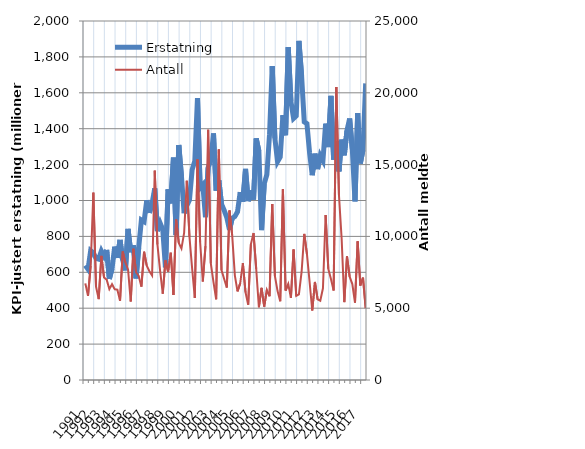
| Category | Erstatning |
|---|---|
| 1991.0 | 638.305 |
| nan | 617.49 |
| nan | 720.489 |
| nan | 708.243 |
| 1992.0 | 677.664 |
| nan | 673.336 |
| nan | 718.939 |
| nan | 690.111 |
| 1993.0 | 724.645 |
| nan | 562.774 |
| nan | 620.914 |
| nan | 743.095 |
| 1994.0 | 680.401 |
| nan | 780.53 |
| nan | 668.973 |
| nan | 610.787 |
| 1995.0 | 841.824 |
| nan | 711.536 |
| nan | 750.775 |
| nan | 566.189 |
| 1996.0 | 737.681 |
| nan | 891.182 |
| nan | 882.294 |
| nan | 1001.12 |
| 1997.0 | 931.155 |
| nan | 984.699 |
| nan | 1067.548 |
| nan | 829.951 |
| 1998.0 | 874.341 |
| nan | 837.865 |
| nan | 627.95 |
| nan | 1062.058 |
| 1999.0 | 984.04 |
| nan | 1239.159 |
| nan | 807.292 |
| nan | 1308.796 |
| 2000.0 | 1135.005 |
| nan | 928.869 |
| nan | 971.109 |
| nan | 1002.211 |
| 2001.0 | 1171.491 |
| nan | 1219.438 |
| nan | 1570.162 |
| nan | 1070.081 |
| 2002.0 | 1086.861 |
| nan | 907.106 |
| nan | 1183.634 |
| nan | 1224.277 |
| 2003.0 | 1373.705 |
| nan | 1054.474 |
| nan | 1113.11 |
| nan | 980.293 |
| 2004.0 | 945.444 |
| nan | 904.425 |
| nan | 836.38 |
| nan | 901.062 |
| 2005.0 | 910.826 |
| nan | 937.052 |
| nan | 1046.812 |
| nan | 993.378 |
| 2006.0 | 1176.283 |
| nan | 996.283 |
| nan | 1056.559 |
| nan | 1005.082 |
| 2007.0 | 1345.962 |
| nan | 1275.048 |
| nan | 835.366 |
| nan | 1092.832 |
| 2008.0 | 1144.621 |
| nan | 1369.428 |
| nan | 1748.539 |
| nan | 1346.977 |
| 2009.0 | 1216.204 |
| nan | 1241.686 |
| nan | 1475.828 |
| nan | 1363.591 |
| 2010.0 | 1854.723 |
| nan | 1552.135 |
| nan | 1457.291 |
| nan | 1471.348 |
| 2011.0 | 1889.184 |
| nan | 1694.934 |
| nan | 1438.377 |
| nan | 1427.875 |
| 2012.0 | 1264.734 |
| nan | 1141.025 |
| nan | 1260.942 |
| nan | 1174.868 |
| 2013.0 | 1250.053 |
| nan | 1222.343 |
| nan | 1427.919 |
| nan | 1297.809 |
| 2014.0 | 1583.326 |
| nan | 1227.429 |
| nan | 1331.604 |
| nan | 1162.233 |
| 2015.0 | 1339.019 |
| nan | 1251.691 |
| nan | 1390.064 |
| nan | 1456.52 |
| 2016.0 | 1285.825 |
| nan | 994.954 |
| nan | 1487.318 |
| nan | 1206.287 |
| 2017.0 | 1282.278 |
| nan | 1652.153 |